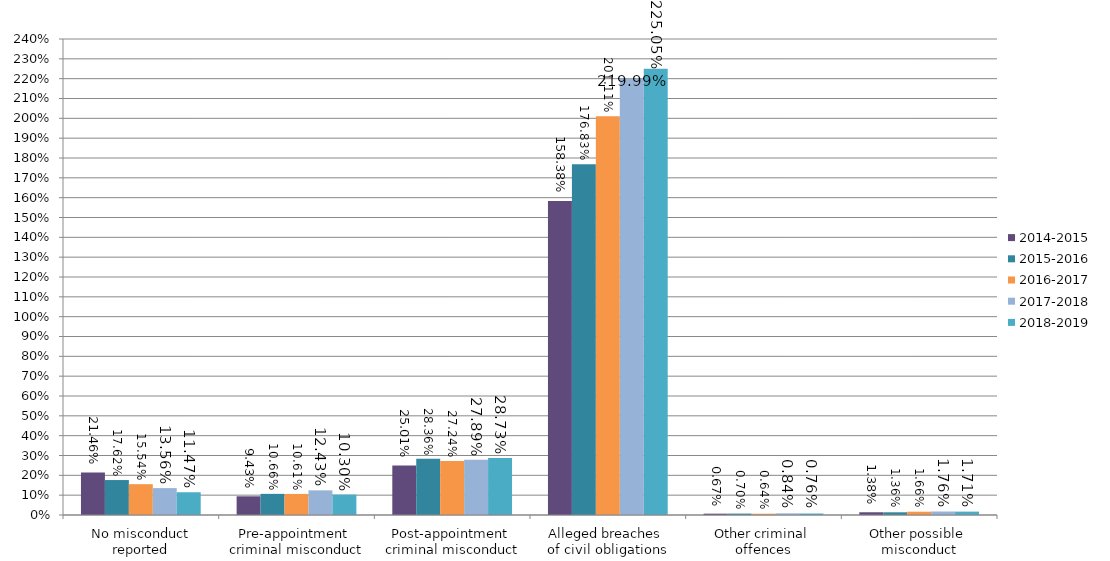
| Category | 2014-2015 | 2015-2016 | 2016-2017 | 2017-2018 | 2018-2019 |
|---|---|---|---|---|---|
| No misconduct reported | 0.215 | 0.176 | 0.155 | 0.136 | 0.115 |
| Pre-appointment 
criminal misconduct | 0.094 | 0.107 | 0.106 | 0.124 | 0.103 |
| Post-appointment 
criminal misconduct | 0.25 | 0.284 | 0.272 | 0.279 | 0.287 |
| Alleged breaches 
of civil obligations | 1.584 | 1.768 | 2.011 | 2.2 | 2.25 |
| Other criminal 
offences | 0.007 | 0.007 | 0.006 | 0.008 | 0.008 |
| Other possible 
misconduct | 0.014 | 0.014 | 0.017 | 0.018 | 0.017 |